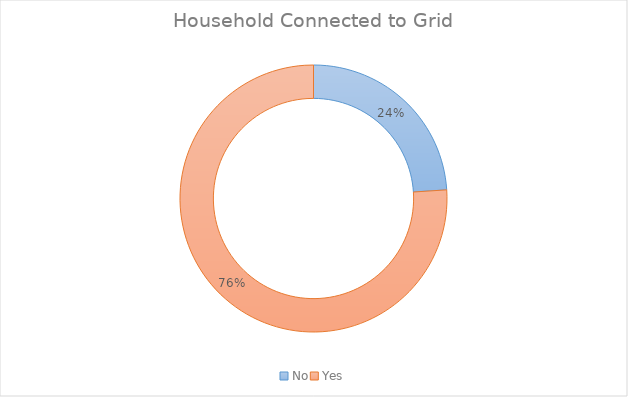
| Category | Series 0 |
|---|---|
| No | 0.24 |
| Yes | 0.76 |